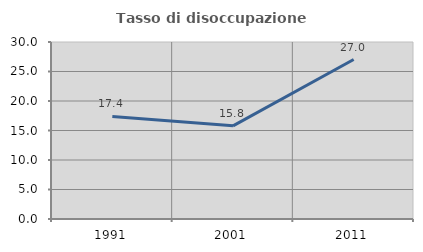
| Category | Tasso di disoccupazione giovanile  |
|---|---|
| 1991.0 | 17.391 |
| 2001.0 | 15.789 |
| 2011.0 | 27.027 |